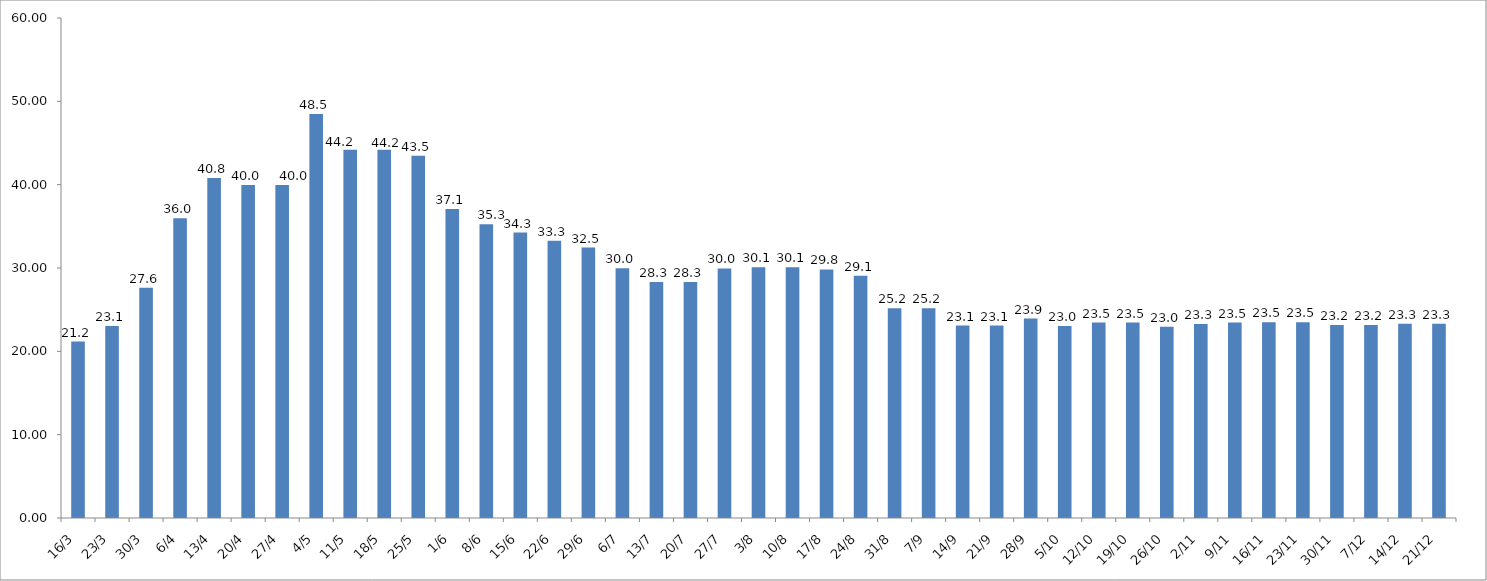
| Category | Series 0 |
|---|---|
| 2020-03-16 | 21.167 |
| 2020-03-23 | 23.05 |
| 2020-03-30 | 27.633 |
| 2020-04-06 | 35.967 |
| 2020-04-13 | 40.8 |
| 2020-04-20 | 39.967 |
| 2020-04-27 | 39.967 |
| 2020-05-04 | 48.483 |
| 2020-05-11 | 44.2 |
| 2020-05-18 | 44.2 |
| 2020-05-25 | 43.483 |
| 2020-06-01 | 37.083 |
| 2020-06-08 | 35.25 |
| 2020-06-15 | 34.25 |
| 2020-06-22 | 33.283 |
| 2020-06-29 | 32.45 |
| 2020-07-06 | 29.983 |
| 2020-07-13 | 28.317 |
| 2020-07-20 | 28.317 |
| 2020-07-27 | 29.95 |
| 2020-08-03 | 30.083 |
| 2020-08-10 | 30.083 |
| 2020-08-17 | 29.833 |
| 2020-08-24 | 29.067 |
| 2020-08-31 | 25.18 |
| 2020-09-07 | 25.18 |
| 2020-09-14 | 23.1 |
| 2020-09-21 | 23.1 |
| 2020-09-28 | 23.933 |
| 2020-10-05 | 23.033 |
| 2020-10-12 | 23.45 |
| 2020-10-19 | 23.45 |
| 2020-10-26 | 22.95 |
| 2020-11-02 | 23.283 |
| 2020-11-09 | 23.45 |
| 2020-11-16 | 23.483 |
| 2020-11-23 | 23.483 |
| 2020-11-30 | 23.15 |
| 2020-12-07 | 23.15 |
| 2020-12-14 | 23.317 |
| 2020-12-21 | 23.317 |